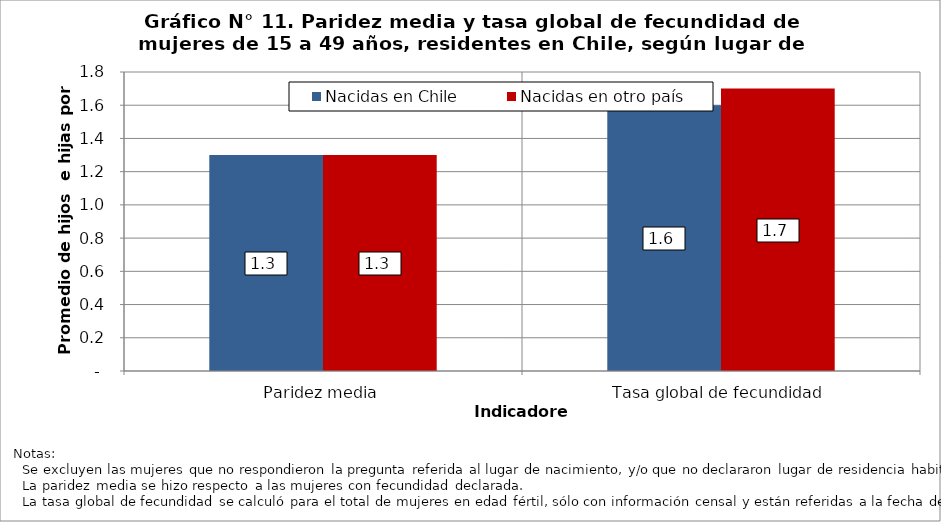
| Category | Nacidas en Chile | Nacidas en otro país |
|---|---|---|
| Paridez media | 1.3 | 1.3 |
| Tasa global de fecundidad | 1.6 | 1.7 |